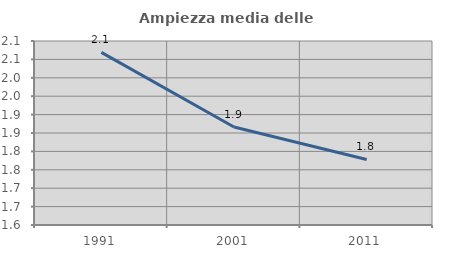
| Category | Ampiezza media delle famiglie |
|---|---|
| 1991.0 | 2.069 |
| 2001.0 | 1.866 |
| 2011.0 | 1.778 |